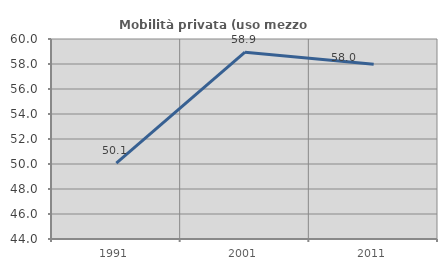
| Category | Mobilità privata (uso mezzo privato) |
|---|---|
| 1991.0 | 50.061 |
| 2001.0 | 58.946 |
| 2011.0 | 57.975 |